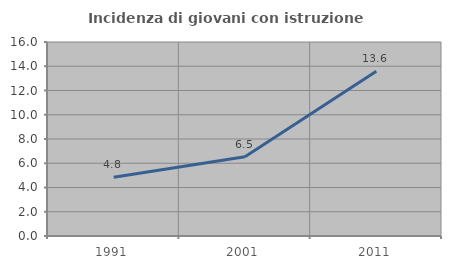
| Category | Incidenza di giovani con istruzione universitaria |
|---|---|
| 1991.0 | 4.839 |
| 2001.0 | 6.542 |
| 2011.0 | 13.592 |